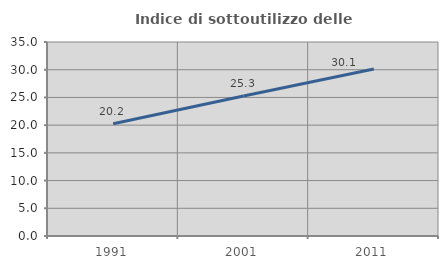
| Category | Indice di sottoutilizzo delle abitazioni  |
|---|---|
| 1991.0 | 20.247 |
| 2001.0 | 25.256 |
| 2011.0 | 30.118 |